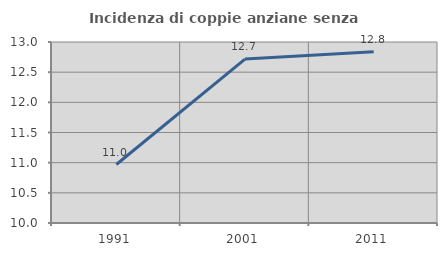
| Category | Incidenza di coppie anziane senza figli  |
|---|---|
| 1991.0 | 10.969 |
| 2001.0 | 12.716 |
| 2011.0 | 12.84 |